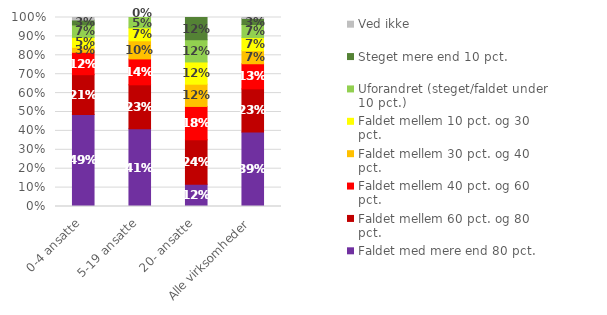
| Category | Faldet med mere end 80 pct.  | Faldet mellem 60 pct. og 80 pct.  | Faldet mellem 40 pct. og 60 pct. | Faldet mellem 30 pct. og 40 pct. | Faldet mellem 10 pct. og 30 pct. | Uforandret (steget/faldet under 10 pct.)  | Steget mere end 10 pct. | Ved ikke |
|---|---|---|---|---|---|---|---|---|
| 0-4 ansatte | 0.487 | 0.211 | 0.118 | 0.026 | 0.053 | 0.066 | 0.026 | 0.013 |
| 5-19 ansatte | 0.411 | 0.233 | 0.137 | 0.096 | 0.068 | 0.055 | 0 | 0 |
| 20- ansatte | 0.118 | 0.235 | 0.176 | 0.118 | 0.118 | 0.118 | 0.118 | 0 |
| Alle virksomheder | 0.394 | 0.229 | 0.133 | 0.069 | 0.069 | 0.069 | 0.032 | 0.005 |